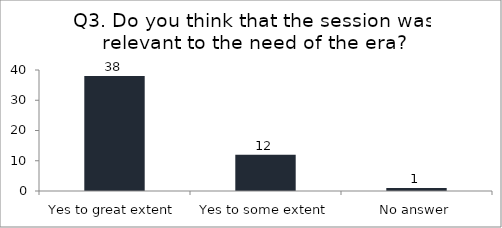
| Category | Q3. Do you think that the session was relevant to the need of the era? |
|---|---|
| Yes to great extent | 38 |
| Yes to some extent | 12 |
| No answer | 1 |